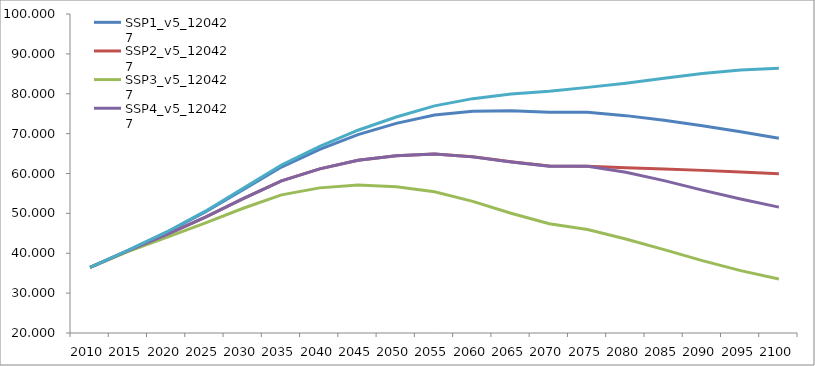
| Category | SSP1_v5_120427 | SSP2_v5_120427 | SSP3_v5_120427 | SSP4_v5_120427 | SSP5_v5_120427 |
|---|---|---|---|---|---|
| 2010.0 | 36.47 | 36.47 | 36.47 | 36.47 | 36.47 |
| 2015.0 | 40.752 | 40.635 | 40.451 | 40.635 | 40.779 |
| 2020.0 | 45.247 | 44.664 | 43.974 | 44.664 | 45.336 |
| 2025.0 | 50.291 | 48.994 | 47.564 | 48.994 | 50.485 |
| 2030.0 | 55.939 | 53.691 | 51.288 | 53.691 | 56.276 |
| 2035.0 | 61.625 | 58.165 | 54.649 | 58.165 | 62.144 |
| 2040.0 | 66.028 | 61.16 | 56.395 | 61.16 | 66.792 |
| 2045.0 | 69.741 | 63.307 | 57.116 | 63.307 | 70.856 |
| 2050.0 | 72.565 | 64.449 | 56.694 | 64.447 | 74.17 |
| 2055.0 | 74.684 | 64.867 | 55.432 | 64.862 | 76.957 |
| 2060.0 | 75.613 | 64.177 | 53.012 | 64.169 | 78.771 |
| 2065.0 | 75.754 | 62.919 | 50.036 | 62.906 | 79.941 |
| 2070.0 | 75.341 | 61.863 | 47.382 | 61.844 | 80.612 |
| 2075.0 | 75.356 | 61.832 | 45.974 | 61.808 | 81.6 |
| 2080.0 | 74.511 | 61.472 | 43.569 | 60.294 | 82.656 |
| 2085.0 | 73.343 | 61.135 | 40.916 | 58.209 | 83.86 |
| 2090.0 | 71.977 | 60.784 | 38.141 | 55.82 | 85.106 |
| 2095.0 | 70.465 | 60.368 | 35.647 | 53.587 | 85.94 |
| 2100.0 | 68.817 | 59.926 | 33.557 | 51.564 | 86.38 |